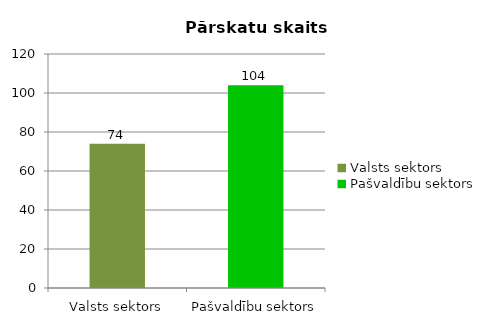
| Category |  Pārskatu skaits |
|---|---|
| Valsts sektors | 74 |
| Pašvaldību sektors | 104 |